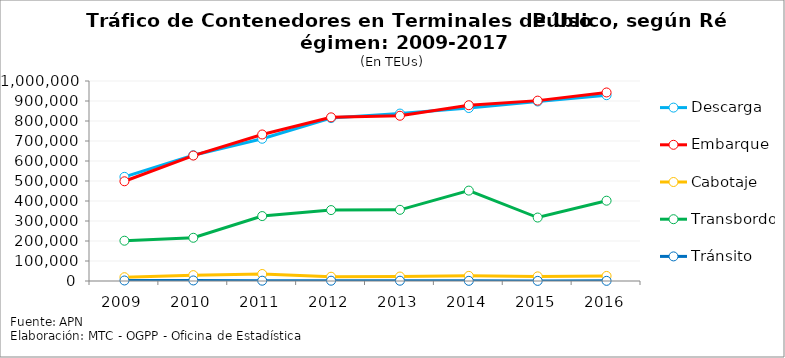
| Category | Descarga | Embarque | Cabotaje | Transbordo | Tránsito |
|---|---|---|---|---|---|
| 2009.0 | 520684 | 498606 | 19007 | 201426 | 2545 |
| 2010.0 | 628913 | 627257 | 29341 | 216128 | 2727 |
| 2011.0 | 711184 | 732597 | 35013 | 324661 | 1490 |
| 2012.0 | 814456 | 818315 | 21300 | 354583 | 1509 |
| 2013.0 | 837154.914 | 826256.086 | 22336 | 355899 | 1427 |
| 2014.0 | 864830.364 | 878860.636 | 25659 | 451965 | 838 |
| 2015.0 | 897526.5 | 901884.5 | 23050 | 317332 | 574 |
| 2016.0 | 929070.449 | 942690.551 | 25254 | 401519 | 750 |